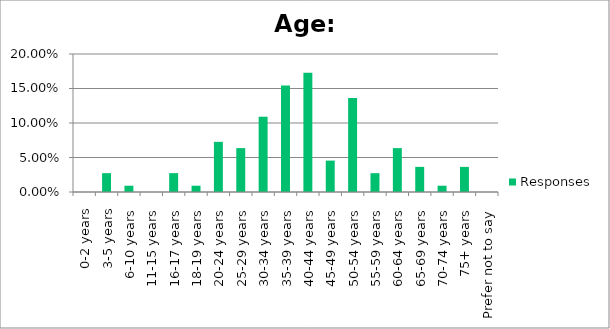
| Category | Responses |
|---|---|
| 0-2 years | 0 |
| 3-5 years | 0.027 |
| 6-10 years | 0.009 |
| 11-15 years | 0 |
| 16-17 years | 0.027 |
| 18-19 years | 0.009 |
| 20-24 years | 0.073 |
| 25-29 years | 0.064 |
| 30-34 years | 0.109 |
| 35-39 years | 0.154 |
| 40-44 years | 0.173 |
| 45-49 years | 0.046 |
| 50-54 years | 0.136 |
| 55-59 years | 0.027 |
| 60-64 years | 0.064 |
| 65-69 years | 0.036 |
| 70-74 years | 0.009 |
| 75+ years | 0.036 |
| Prefer not to say | 0 |